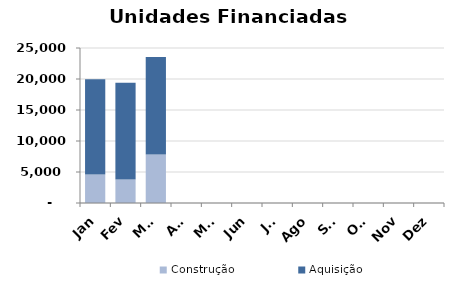
| Category | Construção | Aquisição  |
|---|---|---|
| Jan | 4588 | 15352 |
| Fev | 3778 | 15623 |
| Mar | 7819 | 15723 |
| Abr | 0 | 0 |
| Mai | 0 | 0 |
| Jun | 0 | 0 |
| Jul | 0 | 0 |
| Ago | 0 | 0 |
| Set | 0 | 0 |
| Out | 0 | 0 |
| Nov | 0 | 0 |
| Dez | 0 | 0 |